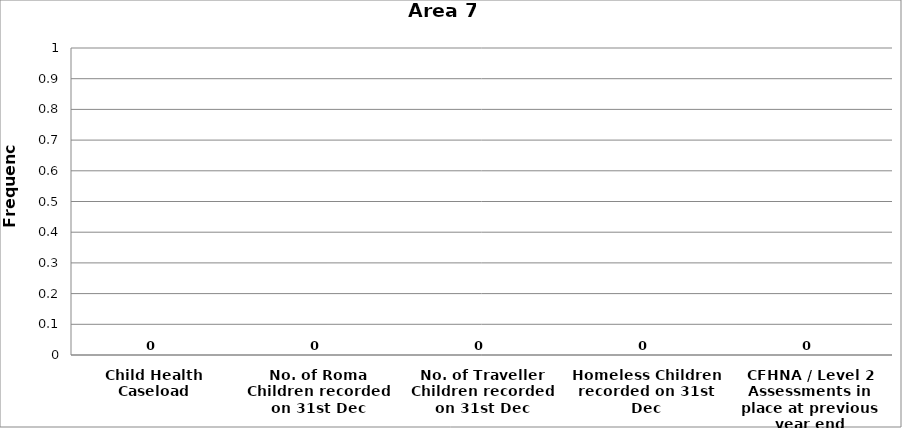
| Category | Area 7 |
|---|---|
| Child Health Caseload | 0 |
| No. of Roma Children recorded on 31st Dec | 0 |
| No. of Traveller Children recorded on 31st Dec | 0 |
| Homeless Children recorded on 31st Dec | 0 |
| CFHNA / Level 2 Assessments in place at previous year end | 0 |